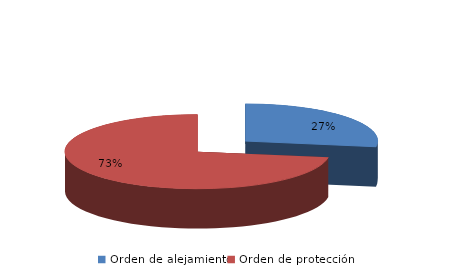
| Category | Series 0 |
|---|---|
| Orden de alejamiento | 212 |
| Orden de protección | 560 |